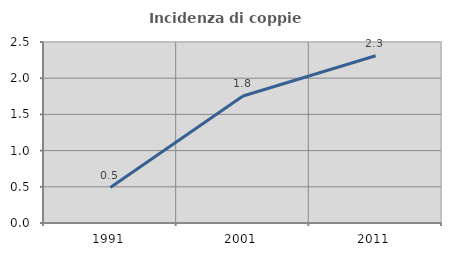
| Category | Incidenza di coppie miste |
|---|---|
| 1991.0 | 0.489 |
| 2001.0 | 1.754 |
| 2011.0 | 2.309 |